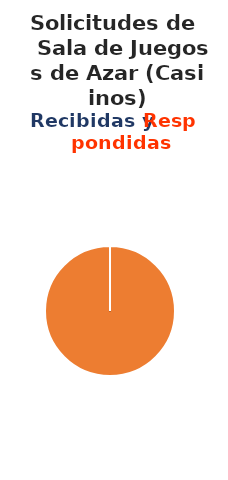
| Category | Series 0 |
|---|---|
| 0 | 0 |
| 1 | 33 |